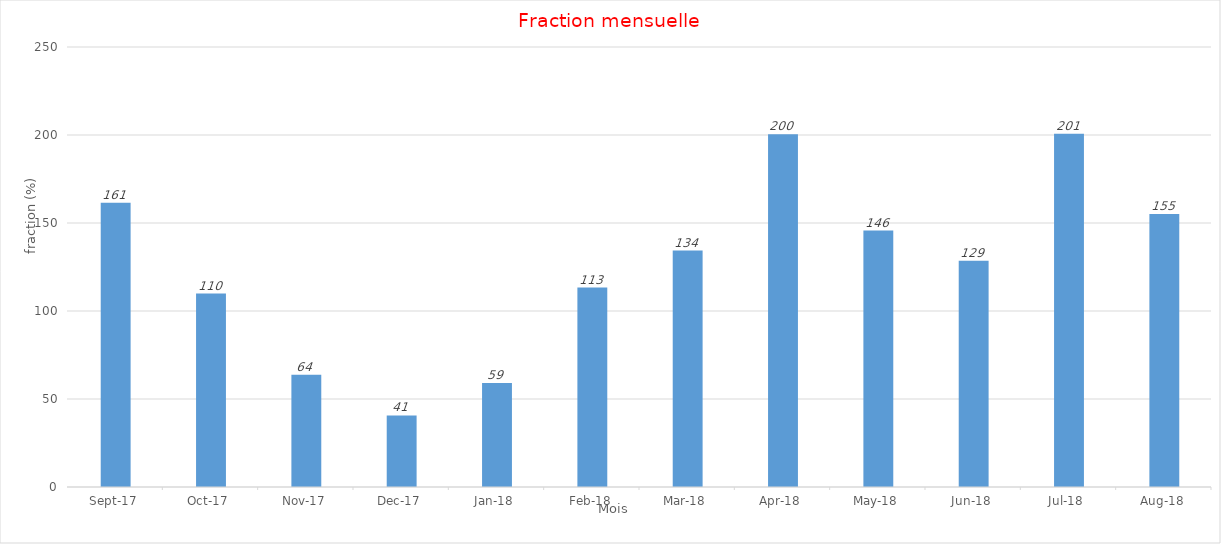
| Category | Series 0 |
|---|---|
| 2017-09-01 | 161.469 |
| 2017-10-01 | 109.875 |
| 2017-11-01 | 63.785 |
| 2017-12-01 | 40.669 |
| 2018-01-01 | 59.15 |
| 2018-02-01 | 113.326 |
| 2018-03-01 | 134.324 |
| 2018-04-01 | 200.464 |
| 2018-05-01 | 145.689 |
| 2018-06-01 | 128.565 |
| 2018-07-01 | 200.651 |
| 2018-08-01 | 155.057 |